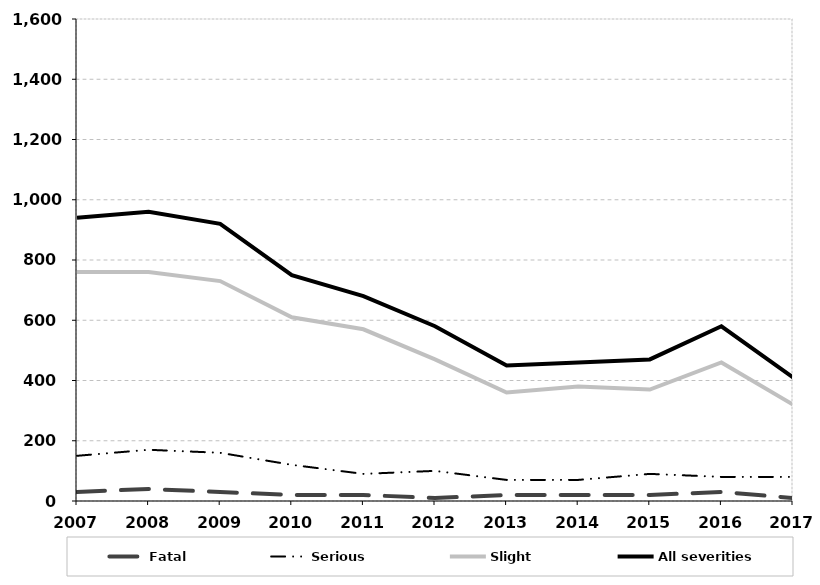
| Category | Fatal | Serious | Slight | All severities |
|---|---|---|---|---|
| 2007.0 | 30 | 150 | 760 | 940 |
| 2008.0 | 40 | 170 | 760 | 960 |
| 2009.0 | 30 | 160 | 730 | 920 |
| 2010.0 | 20 | 120 | 610 | 750 |
| 2011.0 | 20 | 90 | 570 | 680 |
| 2012.0 | 10 | 100 | 470 | 580 |
| 2013.0 | 20 | 70 | 360 | 450 |
| 2014.0 | 20 | 70 | 380 | 460 |
| 2015.0 | 20 | 90 | 370 | 470 |
| 2016.0 | 30 | 80 | 460 | 580 |
| 2017.0 | 10 | 80 | 320 | 410 |